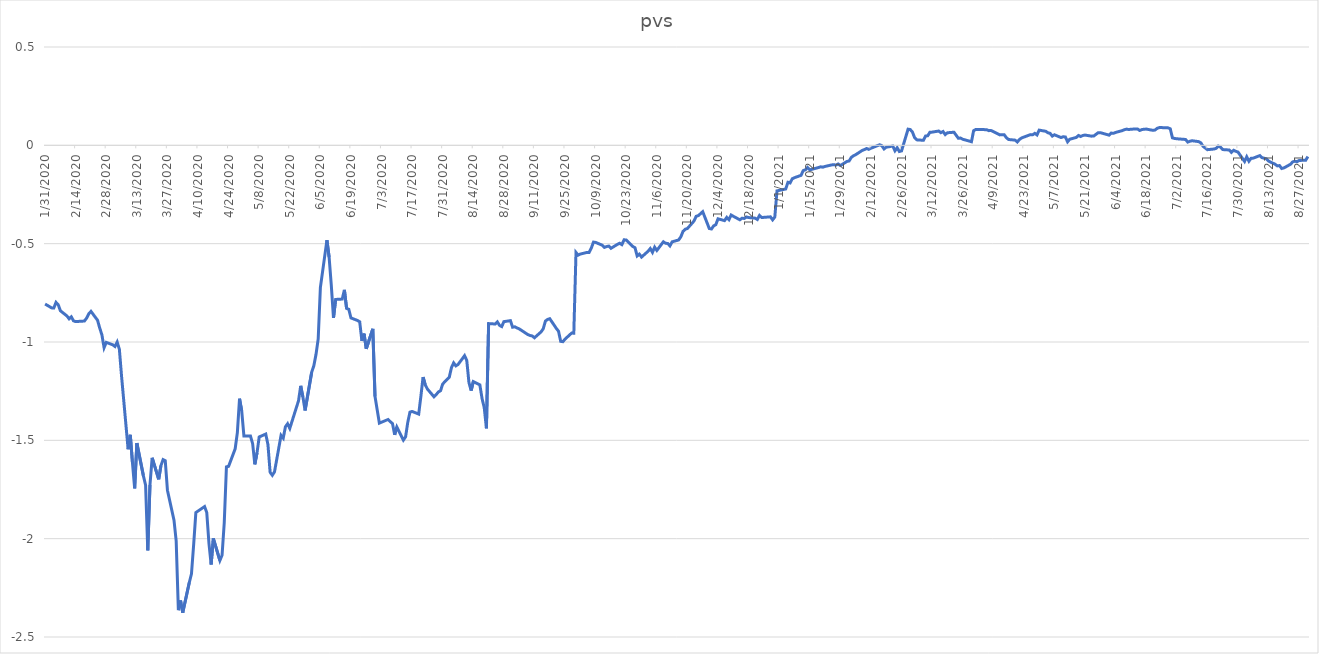
| Category | pvs |
|---|---|
| 1/31/20 | -0.807 |
| 2/3/20 | -0.827 |
| 2/4/20 | -0.827 |
| 2/5/20 | -0.799 |
| 2/6/20 | -0.81 |
| 2/7/20 | -0.841 |
| 2/10/20 | -0.868 |
| 2/11/20 | -0.882 |
| 2/12/20 | -0.872 |
| 2/13/20 | -0.892 |
| 2/14/20 | -0.896 |
| 2/18/20 | -0.893 |
| 2/19/20 | -0.878 |
| 2/20/20 | -0.856 |
| 2/21/20 | -0.844 |
| 2/24/20 | -0.889 |
| 2/25/20 | -0.929 |
| 2/26/20 | -0.963 |
| 2/27/20 | -1.029 |
| 2/28/20 | -1.002 |
| 3/2/20 | -1.014 |
| 3/3/20 | -1.023 |
| 3/4/20 | -1 |
| 3/5/20 | -1.037 |
| 3/6/20 | -1.174 |
| 3/9/20 | -1.545 |
| 3/10/20 | -1.472 |
| 3/11/20 | -1.616 |
| 3/12/20 | -1.744 |
| 3/13/20 | -1.514 |
| 3/16/20 | -1.681 |
| 3/17/20 | -1.728 |
| 3/18/20 | -2.06 |
| 3/19/20 | -1.727 |
| 3/20/20 | -1.589 |
| 3/23/20 | -1.698 |
| 3/24/20 | -1.629 |
| 3/25/20 | -1.598 |
| 3/26/20 | -1.603 |
| 3/27/20 | -1.754 |
| 3/30/20 | -1.906 |
| 3/31/20 | -2.011 |
| 4/1/20 | -2.364 |
| 4/2/20 | -2.315 |
| 4/3/20 | -2.376 |
| 4/6/20 | -2.223 |
| 4/7/20 | -2.178 |
| 4/8/20 | -2.031 |
| 4/9/20 | -1.867 |
| 4/13/20 | -1.837 |
| 4/14/20 | -1.867 |
| 4/15/20 | -2.024 |
| 4/16/20 | -2.131 |
| 4/17/20 | -1.999 |
| 4/20/20 | -2.111 |
| 4/21/20 | -2.084 |
| 4/22/20 | -1.919 |
| 4/23/20 | -1.635 |
| 4/24/20 | -1.632 |
| 4/27/20 | -1.543 |
| 4/28/20 | -1.461 |
| 4/29/20 | -1.288 |
| 4/30/20 | -1.35 |
| 5/1/20 | -1.478 |
| 5/4/20 | -1.478 |
| 5/5/20 | -1.517 |
| 5/6/20 | -1.622 |
| 5/7/20 | -1.564 |
| 5/8/20 | -1.483 |
| 5/11/20 | -1.468 |
| 5/12/20 | -1.521 |
| 5/13/20 | -1.662 |
| 5/14/20 | -1.678 |
| 5/15/20 | -1.66 |
| 5/18/20 | -1.475 |
| 5/19/20 | -1.489 |
| 5/20/20 | -1.431 |
| 5/21/20 | -1.416 |
| 5/22/20 | -1.439 |
| 5/26/20 | -1.299 |
| 5/27/20 | -1.223 |
| 5/28/20 | -1.28 |
| 5/29/20 | -1.348 |
| 6/1/20 | -1.155 |
| 6/2/20 | -1.121 |
| 6/3/20 | -1.063 |
| 6/4/20 | -0.984 |
| 6/5/20 | -0.724 |
| 6/8/20 | -0.482 |
| 6/9/20 | -0.569 |
| 6/10/20 | -0.712 |
| 6/11/20 | -0.877 |
| 6/12/20 | -0.784 |
| 6/15/20 | -0.782 |
| 6/16/20 | -0.735 |
| 6/17/20 | -0.829 |
| 6/18/20 | -0.834 |
| 6/19/20 | -0.878 |
| 6/22/20 | -0.891 |
| 6/23/20 | -0.897 |
| 6/24/20 | -0.994 |
| 6/25/20 | -0.957 |
| 6/26/20 | -1.035 |
| 6/29/20 | -0.933 |
| 6/30/20 | -1.276 |
| 7/1/20 | -1.344 |
| 7/2/20 | -1.412 |
| 7/6/20 | -1.394 |
| 7/7/20 | -1.405 |
| 7/8/20 | -1.414 |
| 7/9/20 | -1.472 |
| 7/10/20 | -1.432 |
| 7/13/20 | -1.499 |
| 7/14/20 | -1.482 |
| 7/15/20 | -1.408 |
| 7/16/20 | -1.357 |
| 7/17/20 | -1.353 |
| 7/20/20 | -1.366 |
| 7/21/20 | -1.276 |
| 7/22/20 | -1.178 |
| 7/23/20 | -1.218 |
| 7/24/20 | -1.239 |
| 7/27/20 | -1.279 |
| 7/28/20 | -1.268 |
| 7/29/20 | -1.254 |
| 7/30/20 | -1.248 |
| 7/31/20 | -1.213 |
| 8/3/20 | -1.179 |
| 8/4/20 | -1.13 |
| 8/5/20 | -1.106 |
| 8/6/20 | -1.121 |
| 8/7/20 | -1.114 |
| 8/10/20 | -1.07 |
| 8/11/20 | -1.093 |
| 8/12/20 | -1.206 |
| 8/13/20 | -1.247 |
| 8/14/20 | -1.201 |
| 8/17/20 | -1.218 |
| 8/18/20 | -1.288 |
| 8/19/20 | -1.334 |
| 8/20/20 | -1.439 |
| 8/21/20 | -0.906 |
| 8/24/20 | -0.908 |
| 8/25/20 | -0.898 |
| 8/26/20 | -0.915 |
| 8/27/20 | -0.922 |
| 8/28/20 | -0.896 |
| 8/31/20 | -0.891 |
| 9/1/20 | -0.925 |
| 9/2/20 | -0.923 |
| 9/3/20 | -0.928 |
| 9/4/20 | -0.933 |
| 9/8/20 | -0.962 |
| 9/9/20 | -0.967 |
| 9/10/20 | -0.969 |
| 9/11/20 | -0.978 |
| 9/14/20 | -0.949 |
| 9/15/20 | -0.933 |
| 9/16/20 | -0.894 |
| 9/17/20 | -0.885 |
| 9/18/20 | -0.882 |
| 9/21/20 | -0.931 |
| 9/22/20 | -0.946 |
| 9/23/20 | -0.997 |
| 9/24/20 | -0.998 |
| 9/25/20 | -0.985 |
| 9/28/20 | -0.955 |
| 9/29/20 | -0.955 |
| 9/30/20 | -0.545 |
| 10/1/20 | -0.558 |
| 10/2/20 | -0.553 |
| 10/5/20 | -0.545 |
| 10/6/20 | -0.545 |
| 10/7/20 | -0.523 |
| 10/8/20 | -0.492 |
| 10/9/20 | -0.494 |
| 10/12/20 | -0.508 |
| 10/13/20 | -0.519 |
| 10/14/20 | -0.515 |
| 10/15/20 | -0.512 |
| 10/16/20 | -0.524 |
| 10/19/20 | -0.503 |
| 10/20/20 | -0.498 |
| 10/21/20 | -0.505 |
| 10/22/20 | -0.481 |
| 10/23/20 | -0.481 |
| 10/26/20 | -0.514 |
| 10/27/20 | -0.521 |
| 10/28/20 | -0.562 |
| 10/29/20 | -0.553 |
| 10/30/20 | -0.568 |
| 11/2/20 | -0.538 |
| 11/3/20 | -0.525 |
| 11/4/20 | -0.544 |
| 11/5/20 | -0.518 |
| 11/6/20 | -0.534 |
| 11/9/20 | -0.49 |
| 11/10/20 | -0.498 |
| 11/11/20 | -0.499 |
| 11/12/20 | -0.511 |
| 11/13/20 | -0.491 |
| 11/16/20 | -0.481 |
| 11/17/20 | -0.465 |
| 11/18/20 | -0.437 |
| 11/19/20 | -0.427 |
| 11/20/20 | -0.423 |
| 11/23/20 | -0.385 |
| 11/24/20 | -0.361 |
| 11/25/20 | -0.357 |
| 11/27/20 | -0.337 |
| 11/30/20 | -0.423 |
| 12/1/20 | -0.425 |
| 12/2/20 | -0.41 |
| 12/3/20 | -0.403 |
| 12/4/20 | -0.374 |
| 12/7/20 | -0.383 |
| 12/8/20 | -0.366 |
| 12/9/20 | -0.378 |
| 12/10/20 | -0.354 |
| 12/11/20 | -0.361 |
| 12/14/20 | -0.379 |
| 12/15/20 | -0.371 |
| 12/16/20 | -0.372 |
| 12/17/20 | -0.364 |
| 12/18/20 | -0.367 |
| 12/21/20 | -0.37 |
| 12/22/20 | -0.377 |
| 12/23/20 | -0.356 |
| 12/24/20 | -0.367 |
| 12/28/20 | -0.364 |
| 12/29/20 | -0.379 |
| 12/30/20 | -0.364 |
| 12/31/20 | -0.232 |
| 1/4/21 | -0.222 |
| 1/5/21 | -0.188 |
| 1/6/21 | -0.191 |
| 1/7/21 | -0.17 |
| 1/8/21 | -0.165 |
| 1/11/21 | -0.153 |
| 1/12/21 | -0.129 |
| 1/13/21 | -0.124 |
| 1/14/21 | -0.113 |
| 1/15/21 | -0.125 |
| 1/19/21 | -0.113 |
| 1/20/21 | -0.109 |
| 1/21/21 | -0.111 |
| 1/22/21 | -0.107 |
| 1/25/21 | -0.1 |
| 1/26/21 | -0.099 |
| 1/27/21 | -0.1 |
| 1/28/21 | -0.095 |
| 1/29/21 | -0.103 |
| 2/1/21 | -0.082 |
| 2/2/21 | -0.08 |
| 2/3/21 | -0.062 |
| 2/4/21 | -0.053 |
| 2/5/21 | -0.048 |
| 2/8/21 | -0.026 |
| 2/9/21 | -0.022 |
| 2/10/21 | -0.016 |
| 2/11/21 | -0.02 |
| 2/12/21 | -0.015 |
| 2/16/21 | 0.003 |
| 2/17/21 | -0.002 |
| 2/18/21 | -0.018 |
| 2/19/21 | -0.01 |
| 2/22/21 | -0.004 |
| 2/23/21 | -0.028 |
| 2/24/21 | -0.012 |
| 2/25/21 | -0.031 |
| 2/26/21 | -0.028 |
| 3/1/21 | 0.082 |
| 3/2/21 | 0.08 |
| 3/3/21 | 0.067 |
| 3/4/21 | 0.039 |
| 3/5/21 | 0.028 |
| 3/8/21 | 0.026 |
| 3/9/21 | 0.047 |
| 3/10/21 | 0.049 |
| 3/11/21 | 0.067 |
| 3/12/21 | 0.067 |
| 3/15/21 | 0.073 |
| 3/16/21 | 0.064 |
| 3/17/21 | 0.07 |
| 3/18/21 | 0.055 |
| 3/19/21 | 0.064 |
| 3/22/21 | 0.067 |
| 3/23/21 | 0.051 |
| 3/24/21 | 0.036 |
| 3/25/21 | 0.037 |
| 3/26/21 | 0.031 |
| 3/29/21 | 0.022 |
| 3/30/21 | 0.018 |
| 3/31/21 | 0.075 |
| 4/1/21 | 0.081 |
| 4/5/21 | 0.08 |
| 4/6/21 | 0.079 |
| 4/7/21 | 0.075 |
| 4/8/21 | 0.075 |
| 4/9/21 | 0.07 |
| 4/12/21 | 0.053 |
| 4/13/21 | 0.054 |
| 4/14/21 | 0.054 |
| 4/15/21 | 0.039 |
| 4/16/21 | 0.03 |
| 4/19/21 | 0.026 |
| 4/20/21 | 0.017 |
| 4/21/21 | 0.03 |
| 4/22/21 | 0.038 |
| 4/23/21 | 0.042 |
| 4/26/21 | 0.054 |
| 4/27/21 | 0.054 |
| 4/28/21 | 0.061 |
| 4/29/21 | 0.053 |
| 4/30/21 | 0.077 |
| 5/3/21 | 0.072 |
| 5/4/21 | 0.064 |
| 5/5/21 | 0.061 |
| 5/6/21 | 0.047 |
| 5/7/21 | 0.054 |
| 5/10/21 | 0.04 |
| 5/11/21 | 0.044 |
| 5/12/21 | 0.042 |
| 5/13/21 | 0.018 |
| 5/14/21 | 0.031 |
| 5/17/21 | 0.04 |
| 5/18/21 | 0.05 |
| 5/19/21 | 0.045 |
| 5/20/21 | 0.05 |
| 5/21/21 | 0.052 |
| 5/24/21 | 0.047 |
| 5/25/21 | 0.048 |
| 5/26/21 | 0.056 |
| 5/27/21 | 0.064 |
| 5/28/21 | 0.064 |
| 6/1/21 | 0.052 |
| 6/2/21 | 0.062 |
| 6/3/21 | 0.061 |
| 6/4/21 | 0.066 |
| 6/7/21 | 0.075 |
| 6/8/21 | 0.079 |
| 6/9/21 | 0.083 |
| 6/10/21 | 0.08 |
| 6/11/21 | 0.082 |
| 6/14/21 | 0.083 |
| 6/15/21 | 0.075 |
| 6/16/21 | 0.08 |
| 6/17/21 | 0.082 |
| 6/18/21 | 0.083 |
| 6/21/21 | 0.076 |
| 6/22/21 | 0.078 |
| 6/23/21 | 0.086 |
| 6/24/21 | 0.09 |
| 6/25/21 | 0.09 |
| 6/28/21 | 0.089 |
| 6/29/21 | 0.084 |
| 6/30/21 | 0.038 |
| 7/1/21 | 0.035 |
| 7/2/21 | 0.033 |
| 7/6/21 | 0.03 |
| 7/7/21 | 0.017 |
| 7/8/21 | 0.021 |
| 7/9/21 | 0.023 |
| 7/12/21 | 0.019 |
| 7/13/21 | 0.012 |
| 7/14/21 | -0.005 |
| 7/15/21 | -0.014 |
| 7/16/21 | -0.022 |
| 7/19/21 | -0.019 |
| 7/20/21 | -0.015 |
| 7/21/21 | -0.004 |
| 7/22/21 | -0.009 |
| 7/23/21 | -0.022 |
| 7/26/21 | -0.024 |
| 7/27/21 | -0.036 |
| 7/28/21 | -0.025 |
| 7/29/21 | -0.03 |
| 7/30/21 | -0.034 |
| 8/2/21 | -0.082 |
| 8/3/21 | -0.058 |
| 8/4/21 | -0.081 |
| 8/5/21 | -0.066 |
| 8/6/21 | -0.065 |
| 8/9/21 | -0.052 |
| 8/10/21 | -0.063 |
| 8/11/21 | -0.066 |
| 8/12/21 | -0.069 |
| 8/13/21 | -0.08 |
| 8/16/21 | -0.096 |
| 8/17/21 | -0.105 |
| 8/18/21 | -0.103 |
| 8/19/21 | -0.118 |
| 8/20/21 | -0.115 |
| 8/23/21 | -0.096 |
| 8/24/21 | -0.085 |
| 8/25/21 | -0.081 |
| 8/26/21 | -0.083 |
| 8/27/21 | -0.077 |
| 8/30/21 | -0.076 |
| 8/31/21 | -0.057 |